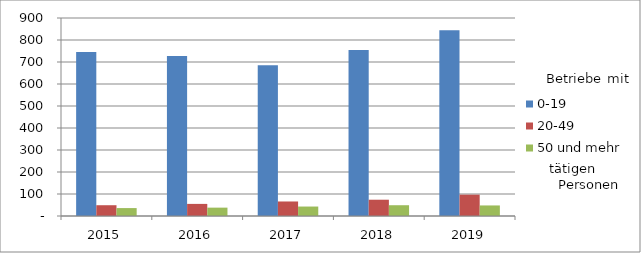
| Category | 0-19 | 20-49 | 50 und mehr |
|---|---|---|---|
| 2015.0 | 745 | 49 | 36 |
| 2016.0 | 727 | 55 | 38 |
| 2017.0 | 685 | 66 | 43 |
| 2018.0 | 755 | 74 | 49 |
| 2019.0 | 844 | 97 | 48 |